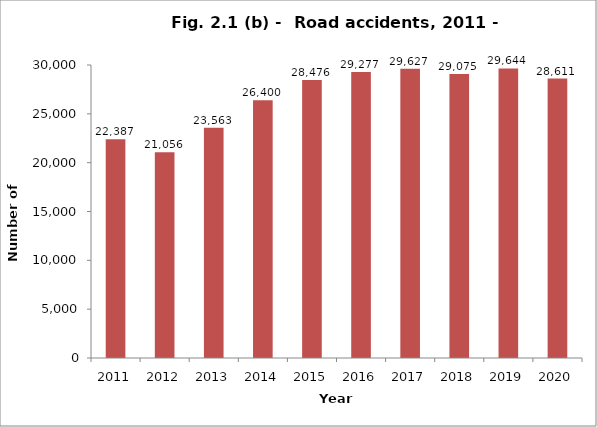
| Category | accidents |
|---|---|
| 2011.0 | 22387 |
| 2012.0 | 21056 |
| 2013.0 | 23563 |
| 2014.0 | 26400 |
| 2015.0 | 28476 |
| 2016.0 | 29277 |
| 2017.0 | 29627 |
| 2018.0 | 29075 |
| 2019.0 | 29644 |
| 2020.0 | 28611 |